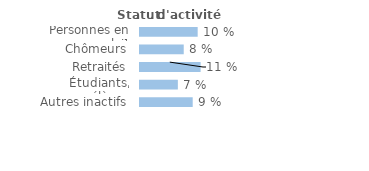
| Category | Series 0 |
|---|---|
| Personnes en emploi¹ | 0.103 |
| Chômeurs | 0.078 |
| Retraités | 0.108 |
| Étudiants, élèves | 0.068 |
| Autres inactifs  | 0.094 |